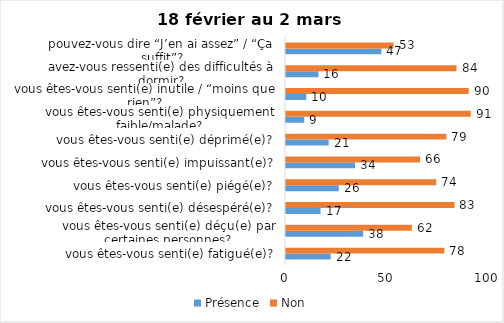
| Category | Présence | Non |
|---|---|---|
| vous êtes-vous senti(e) fatigué(e)? | 22 | 78 |
| vous êtes-vous senti(e) déçu(e) par certaines personnes? | 38 | 62 |
| vous êtes-vous senti(e) désespéré(e)? | 17 | 83 |
| vous êtes-vous senti(e) piégé(e)? | 26 | 74 |
| vous êtes-vous senti(e) impuissant(e)? | 34 | 66 |
| vous êtes-vous senti(e) déprimé(e)? | 21 | 79 |
| vous êtes-vous senti(e) physiquement faible/malade? | 9 | 91 |
| vous êtes-vous senti(e) inutile / “moins que rien”? | 10 | 90 |
| avez-vous ressenti(e) des difficultés à dormir? | 16 | 84 |
| pouvez-vous dire “J’en ai assez” / “Ça suffit”? | 47 | 53 |